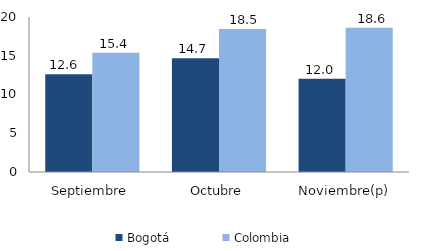
| Category | Bogotá | Colombia |
|---|---|---|
| Septiembre | 12.624 | 15.394 |
| Octubre | 14.67 | 18.455 |
| Noviembre(p) | 12.029 | 18.619 |